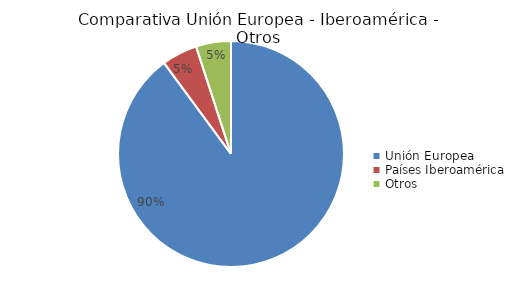
| Category | Series 0 |
|---|---|
| Unión Europea | 4708 |
| Países Iberoamérica | 267 |
| Otros | 262 |